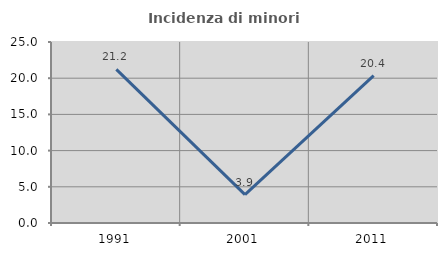
| Category | Incidenza di minori stranieri |
|---|---|
| 1991.0 | 21.212 |
| 2001.0 | 3.922 |
| 2011.0 | 20.364 |